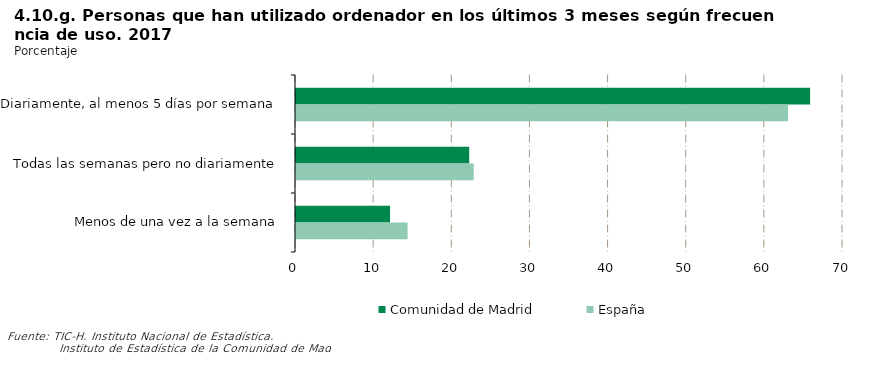
| Category | Comunidad de Madrid | España |
|---|---|---|
| Diariamente, al menos 5 días por semana | 65.796 | 62.973 |
| Todas las semanas pero no diariamente | 22.168 | 22.746 |
| Menos de una vez a la semana | 12.036 | 14.281 |